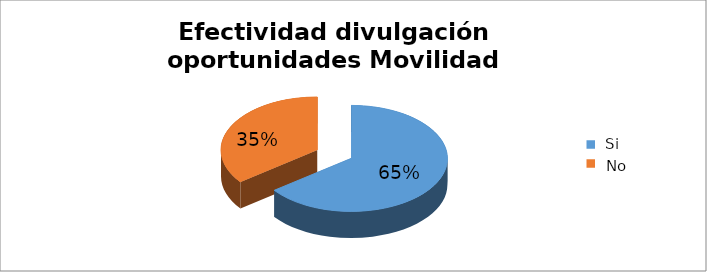
| Category | Series 0 |
|---|---|
| 0 | 0.647 |
| 1 | 0.353 |